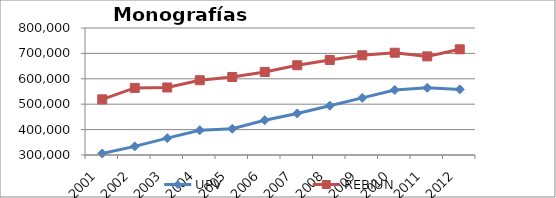
| Category | UPV | REBIUN |
|---|---|---|
| 2001 | 305920 | 519111.833 |
| 2002 | 334000 | 564234.319 |
| 2003 | 366269 | 565838.479 |
| 2004 | 397485 | 594412.694 |
| 2005 | 403330 | 607168.51 |
| 2006 | 436940 | 627166.837 |
| 2007 | 463595 | 653325.551 |
| 2008 | 494082 | 674035.531 |
| 2009 | 524743 | 692506.857 |
| 2010 | 555981 | 702667 |
| 2011 | 564507 | 688234 |
| 2012 | 558311 | 716212 |